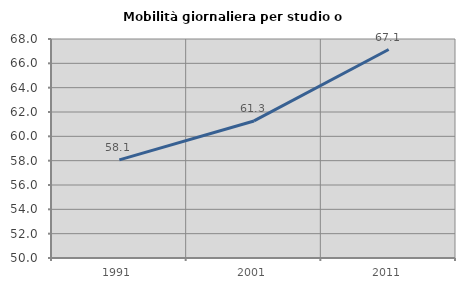
| Category | Mobilità giornaliera per studio o lavoro |
|---|---|
| 1991.0 | 58.065 |
| 2001.0 | 61.264 |
| 2011.0 | 67.134 |